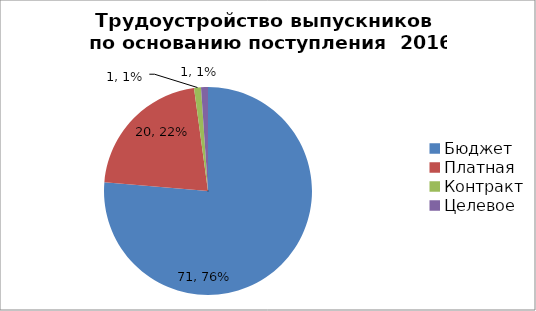
| Category | 2016 г. |
|---|---|
| Бюджет | 71 |
| Платная | 20 |
| Контракт | 1 |
| Целевое | 1 |